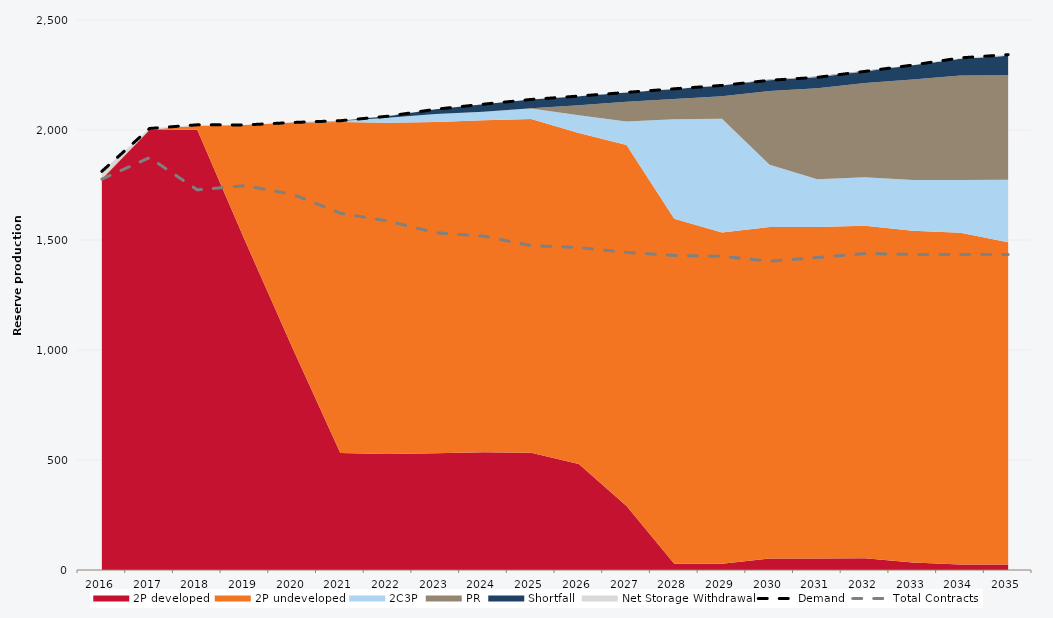
| Category | Demand | Total Contracts |
|---|---|---|
| 0 | 1812.091 | 1776.781 |
| 1 | 2006.953 | 1874.371 |
| 2 | 2023.646 | 1727.997 |
| 3 | 2022.926 | 1746.967 |
| 4 | 2034.107 | 1707.643 |
| 5 | 2042.198 | 1621.977 |
| 6 | 2062.789 | 1586.126 |
| 7 | 2094.479 | 1533.126 |
| 8 | 2117.291 | 1517.777 |
| 9 | 2138.826 | 1474.136 |
| 10 | 2154.196 | 1466.013 |
| 11 | 2170.925 | 1443.817 |
| 12 | 2187.282 | 1429.645 |
| 13 | 2202.658 | 1425.788 |
| 14 | 2225.903 | 1403.548 |
| 15 | 2239.407 | 1420.349 |
| 16 | 2266.462 | 1438.314 |
| 17 | 2295.206 | 1434.467 |
| 18 | 2327.823 | 1434.453 |
| 19 | 2342.567 | 1434.032 |